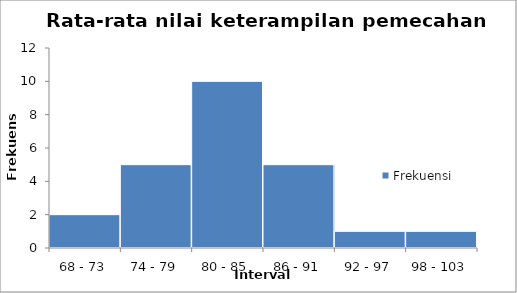
| Category | Frekuensi |
|---|---|
| 68 - 73 | 2 |
| 74 - 79 | 5 |
| 80 - 85 | 10 |
| 86 - 91 | 5 |
| 92 - 97 | 1 |
| 98 - 103 | 1 |